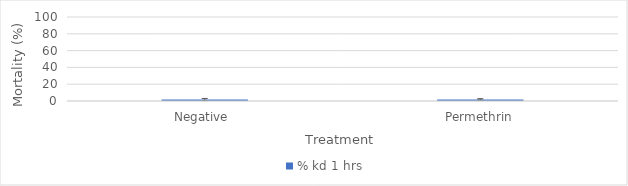
| Category | % kd 1 hrs |
|---|---|
| Negative  | 1.754 |
| Permethrin | 1.852 |